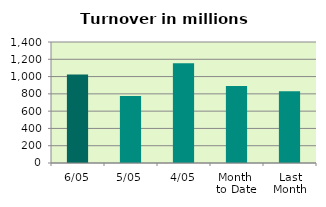
| Category | Series 0 |
|---|---|
| 6/05 | 1023.201 |
| 5/05 | 776.011 |
| 4/05 | 1153.483 |
| Month 
to Date | 891.462 |
| Last
Month | 829.993 |